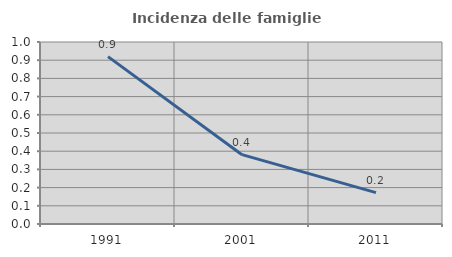
| Category | Incidenza delle famiglie numerose |
|---|---|
| 1991.0 | 0.92 |
| 2001.0 | 0.381 |
| 2011.0 | 0.172 |